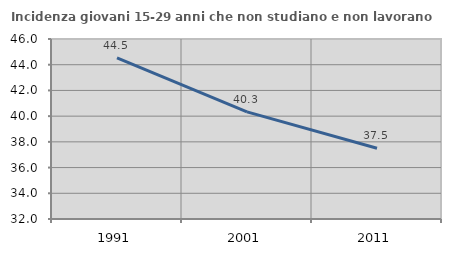
| Category | Incidenza giovani 15-29 anni che non studiano e non lavorano  |
|---|---|
| 1991.0 | 44.527 |
| 2001.0 | 40.336 |
| 2011.0 | 37.5 |